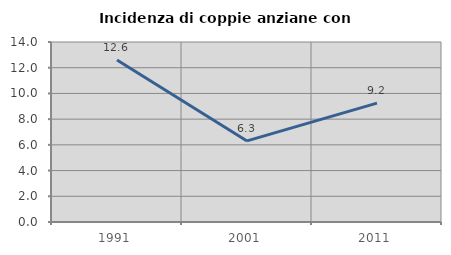
| Category | Incidenza di coppie anziane con figli |
|---|---|
| 1991.0 | 12.605 |
| 2001.0 | 6.306 |
| 2011.0 | 9.247 |